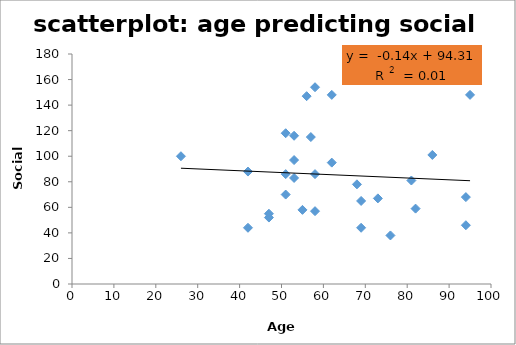
| Category | SSQ |
|---|---|
| 42.0 | 44 |
| 55.0 | 58 |
| 47.0 | 52 |
| 58.0 | 57 |
| 57.0 | 115 |
| 68.0 | 78 |
| 94.0 | 68 |
| 69.0 | 65 |
| 58.0 | 86 |
| 53.0 | 116 |
| 69.0 | 44 |
| 73.0 | 67 |
| 94.0 | 46 |
| 51.0 | 118 |
| 56.0 | 147 |
| 26.0 | 100 |
| 86.0 | 101 |
| 95.0 | 148 |
| 51.0 | 70 |
| 62.0 | 95 |
| 42.0 | 88 |
| 53.0 | 97 |
| 62.0 | 148 |
| 47.0 | 55 |
| 82.0 | 59 |
| 81.0 | 81 |
| 76.0 | 38 |
| 53.0 | 83 |
| 58.0 | 154 |
| 51.0 | 86 |